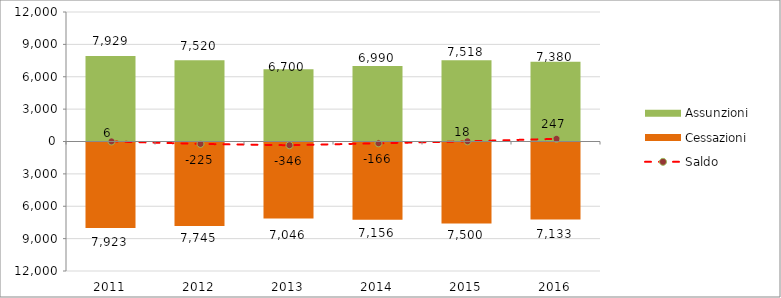
| Category | Assunzioni | Cessazioni |
|---|---|---|
| 2011.0 | 7929 | -7923 |
| 2012.0 | 7520 | -7745 |
| 2013.0 | 6700 | -7046 |
| 2014.0 | 6990 | -7156 |
| 2015.0 | 7518 | -7500 |
| 2016.0 | 7380 | -7133 |